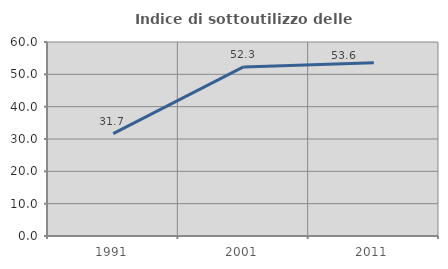
| Category | Indice di sottoutilizzo delle abitazioni  |
|---|---|
| 1991.0 | 31.683 |
| 2001.0 | 52.294 |
| 2011.0 | 53.608 |